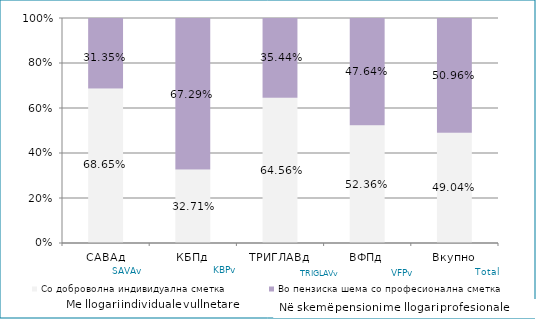
| Category | Со доброволна индивидуална сметка  | Во пензиска шема со професионална сметка |
|---|---|---|
| САВАд | 0.686 | 0.314 |
| КБПд | 0.327 | 0.673 |
| ТРИГЛАВд | 0.646 | 0.354 |
| ВФПд | 0.524 | 0.476 |
| Вкупно | 0.49 | 0.51 |